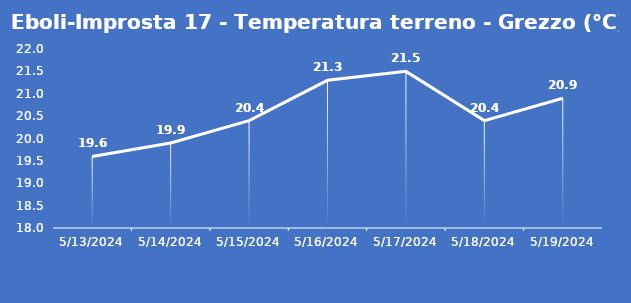
| Category | Eboli-Improsta 17 - Temperatura terreno - Grezzo (°C) |
|---|---|
| 5/13/24 | 19.6 |
| 5/14/24 | 19.9 |
| 5/15/24 | 20.4 |
| 5/16/24 | 21.3 |
| 5/17/24 | 21.5 |
| 5/18/24 | 20.4 |
| 5/19/24 | 20.9 |